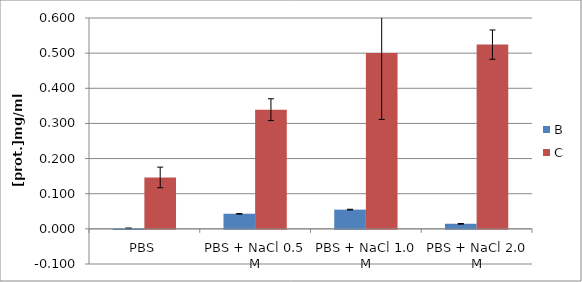
| Category | B | C |
|---|---|---|
| PBS | 0 | 0.146 |
| PBS + NaCl 0.5 M | 0.043 | 0.339 |
| PBS + NaCl 1.0 M | 0.055 | 0.501 |
| PBS + NaCl 2.0 M | 0.014 | 0.524 |